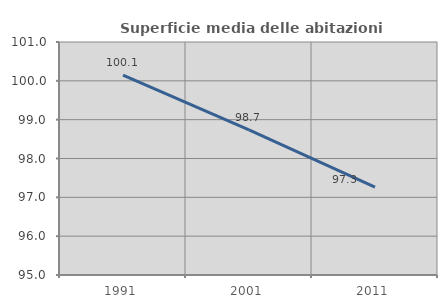
| Category | Superficie media delle abitazioni occupate |
|---|---|
| 1991.0 | 100.145 |
| 2001.0 | 98.737 |
| 2011.0 | 97.263 |